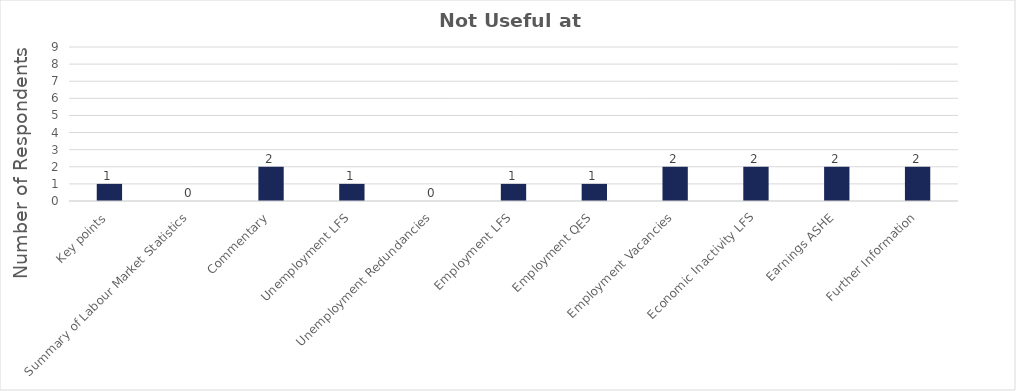
| Category | Not Useful at all |
|---|---|
| Key points | 1 |
| Summary of Labour Market Statistics | 0 |
| Commentary | 2 |
| Unemployment LFS | 1 |
| Unemployment Redundancies | 0 |
| Employment LFS | 1 |
| Employment QES | 1 |
| Employment Vacancies | 2 |
| Economic Inactivity LFS | 2 |
| Earnings ASHE | 2 |
| Further Information | 2 |